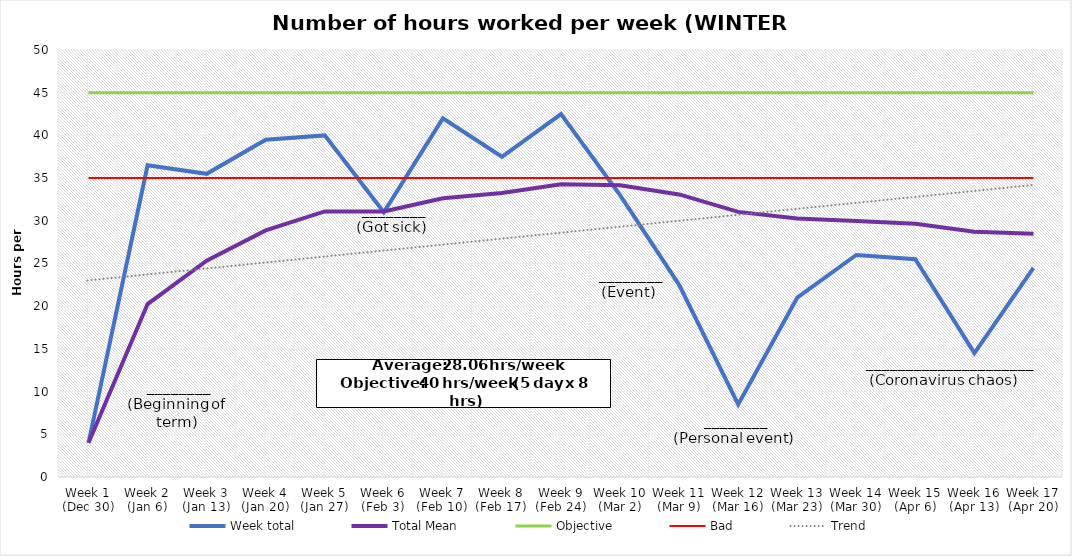
| Category | Week total | Total Mean | Objective | Bad |
|---|---|---|---|---|
| Week 1 (Dec 30) | 4 | 4 | 45 | 35 |
| Week 2 (Jan 6) | 36.5 | 20.25 | 45 | 35 |
| Week 3 (Jan 13) | 35.5 | 25.333 | 45 | 35 |
| Week 4 (Jan 20) | 39.5 | 28.875 | 45 | 35 |
| Week 5 (Jan 27) | 40 | 31.1 | 45 | 35 |
| Week 6 (Feb 3) | 31 | 31.083 | 45 | 35 |
| Week 7 (Feb 10) | 42 | 32.643 | 45 | 35 |
| Week 8 (Feb 17) | 37.5 | 33.25 | 45 | 35 |
| Week 9 (Feb 24) | 42.5 | 34.278 | 45 | 35 |
| Week 10 (Mar 2) | 33 | 34.15 | 45 | 35 |
| Week 11 (Mar 9) | 22.5 | 33.091 | 45 | 35 |
| Week 12 (Mar 16) | 8.5 | 31.042 | 45 | 35 |
| Week 13 (Mar 23) | 21 | 30.269 | 45 | 35 |
| Week 14 (Mar 30) | 26 | 29.964 | 45 | 35 |
| Week 15 (Apr 6) | 25.5 | 29.667 | 45 | 35 |
| Week 16 (Apr 13) | 14.5 | 28.719 | 45 | 35 |
| Week 17 (Apr 20) | 24.5 | 28.471 | 45 | 35 |